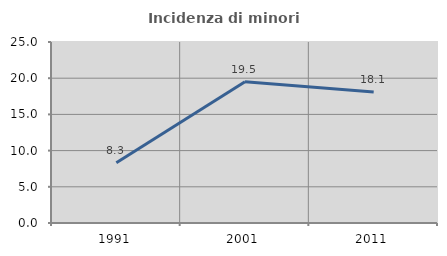
| Category | Incidenza di minori stranieri |
|---|---|
| 1991.0 | 8.333 |
| 2001.0 | 19.512 |
| 2011.0 | 18.085 |